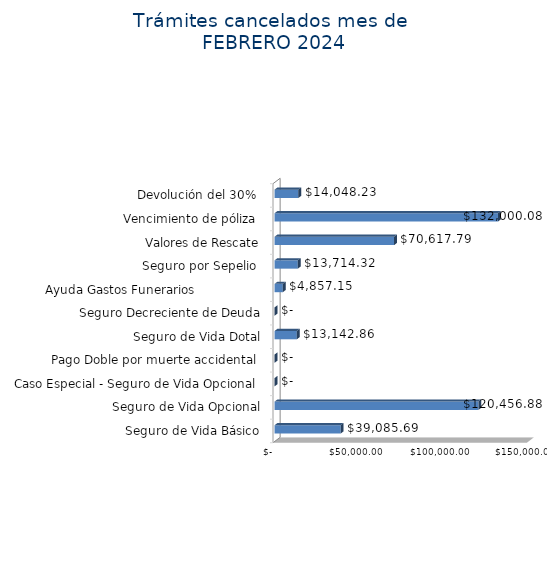
| Category | Monto  |
|---|---|
| Seguro de Vida Básico | 39085.69 |
| Seguro de Vida Opcional | 120456.88 |
| Caso Especial - Seguro de Vida Opcional  | 0 |
| Pago Doble por muerte accidental  | 0 |
| Seguro de Vida Dotal | 13142.86 |
| Seguro Decreciente de Deuda | 0 |
| Ayuda Gastos Funerarios                  | 4857.15 |
| Seguro por Sepelio  | 13714.32 |
| Valores de Rescate | 70617.79 |
| Vencimiento de póliza  | 132000.08 |
| Devolución del 30%  | 14048.23 |